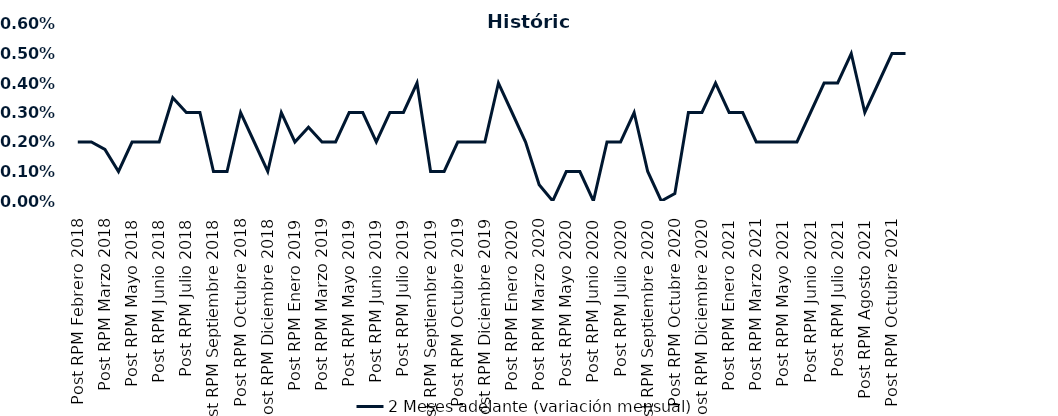
| Category | 2 Meses adelante (variación mensual) |
|---|---|
| Post RPM Febrero 2018 | 0.002 |
| Pre RPM Marzo 2018 | 0.002 |
| Post RPM Marzo 2018 | 0.002 |
| Pre RPM Mayo 2018 | 0.001 |
| Post RPM Mayo 2018 | 0.002 |
| Pre RPM Junio 2018 | 0.002 |
| Post RPM Junio 2018 | 0.002 |
| Pre RPM Julio 2018 | 0.004 |
| Post RPM Julio 2018 | 0.003 |
| Pre RPM Septiembre 2018 | 0.003 |
| Post RPM Septiembre 2018 | 0.001 |
| Pre RPM Octubre 2018 | 0.001 |
| Post RPM Octubre 2018 | 0.003 |
| Pre RPM Diciembre 2018 | 0.002 |
| Post RPM Diciembre 2018 | 0.001 |
| Pre RPM Enero 2019 | 0.003 |
| Post RPM Enero 2019 | 0.002 |
| Pre RPM Marzo 2019 | 0.002 |
| Post RPM Marzo 2019 | 0.002 |
| Pre RPM Mayo 2019 | 0.002 |
| Post RPM Mayo 2019 | 0.003 |
| Pre RPM Junio 2019 | 0.003 |
| Post RPM Junio 2019 | 0.002 |
| Pre RPM Julio 2019 | 0.003 |
| Post RPM Julio 2019 | 0.003 |
| Pre RPM Septiembre 2019 | 0.004 |
| Post RPM Septiembre 2019 | 0.001 |
| Pre RPM Octubre 2019 | 0.001 |
| Post RPM Octubre 2019 | 0.002 |
| Pre RPM Diciembre 2019 | 0.002 |
| Post RPM Diciembre 2019 | 0.002 |
| Pre RPM Enero 2020 | 0.004 |
| Post RPM Enero 2020 | 0.003 |
| Pre RPM Marzo 2020 | 0.002 |
| Post RPM Marzo 2020 | 0.001 |
| Pre RPM Mayo 2020 | 0 |
| Post RPM Mayo 2020 | 0.001 |
| Pre RPM Junio 2020 | 0.001 |
| Post RPM Junio 2020 | 0 |
| Pre RPM Julio 2020 | 0.002 |
| Post RPM Julio 2020 | 0.002 |
| Pre RPM Septiembre 2020 | 0.003 |
| Post RPM Septiembre 2020 | 0.001 |
| Pre RPM Octubre 2020 | 0 |
| Post RPM Octubre 2020 | 0 |
| Pre RPM Diciembre 2020 | 0.003 |
| Post RPM Diciembre 2020 | 0.003 |
| Pre RPM Enero 2021 | 0.004 |
| Post RPM Enero 2021 | 0.003 |
| Pre RPM Marzo 2021 | 0.003 |
| Post RPM Marzo 2021 | 0.002 |
| Pre RPM Mayo 2021 | 0.002 |
| Post RPM Mayo 2021 | 0.002 |
| Pre RPM Junio 2021 | 0.002 |
| Post RPM Junio 2021 | 0.003 |
| Pre RPM Julio 2021 | 0.004 |
| Post RPM Julio 2021 | 0.004 |
| Pre RPM Agosto 2021 | 0.005 |
| Post RPM Agosto 2021 | 0.003 |
| Pre RPM Octubre 2021 | 0.004 |
| Post RPM Octubre 2021 | 0.005 |
| Pre RPM Diciembre 2021 | 0.005 |